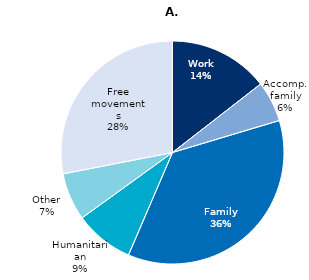
| Category | Series 0 |
|---|---|
| Work | 659464 |
| Accomp. family | 268210 |
| Family | 1642830.265 |
| Humanitarian | 390696 |
| Other | 313699 |
| Free movements | 1278441.48 |